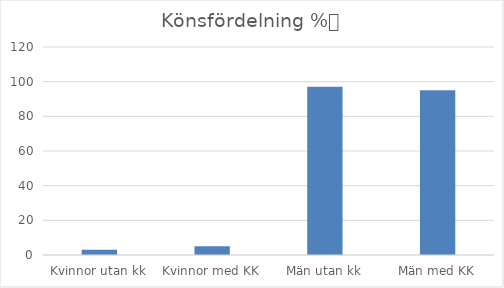
| Category | Andel |
|---|---|
| Kvinnor utan kk | 3 |
| Kvinnor med KK | 5 |
| Män utan kk | 97 |
| Män med KK | 95 |